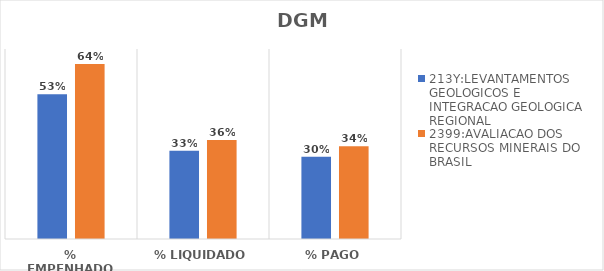
| Category | 213Y:LEVANTAMENTOS GEOLOGICOS E INTEGRACAO GEOLOGICA REGIONAL | 2399:AVALIACAO DOS RECURSOS MINERAIS DO BRASIL |
|---|---|---|
| % EMPENHADO | 0.533 | 0.644 |
| % LIQUIDADO | 0.325 | 0.365 |
| % PAGO | 0.303 | 0.342 |